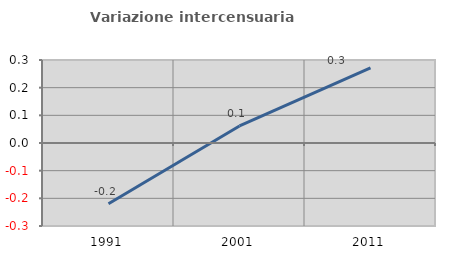
| Category | Variazione intercensuaria annua |
|---|---|
| 1991.0 | -0.22 |
| 2001.0 | 0.062 |
| 2011.0 | 0.272 |